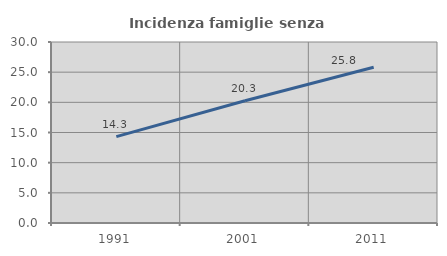
| Category | Incidenza famiglie senza nuclei |
|---|---|
| 1991.0 | 14.318 |
| 2001.0 | 20.274 |
| 2011.0 | 25.82 |